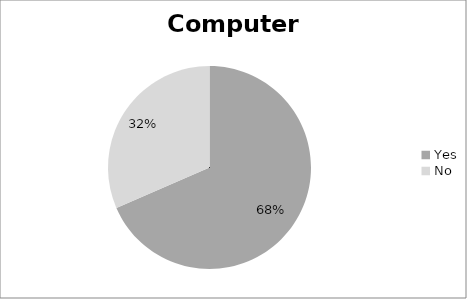
| Category | Series 0 |
|---|---|
| Yes | 63 |
| No | 29 |